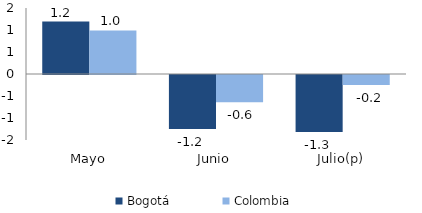
| Category | Bogotá | Colombia |
|---|---|---|
| Mayo | 1.191 | 0.991 |
| Junio | -1.229 | -0.618 |
| Julio(p) | -1.293 | -0.229 |